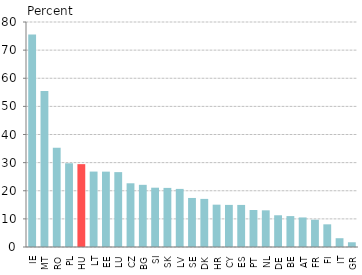
| Category | 2013-2019 |
|---|---|
| IE | 75.526 |
| MT | 55.45 |
| RO | 35.309 |
| PL | 29.769 |
| HU | 29.458 |
| LT | 26.818 |
| EE | 26.793 |
| LU | 26.624 |
| CZ | 22.655 |
| BG | 22.105 |
| SI | 21.085 |
| SK | 21.013 |
| LV | 20.655 |
| SE | 17.436 |
| DK | 17.105 |
| HR | 15.051 |
| CY | 14.967 |
| ES | 14.96 |
| PT | 13.147 |
| NL | 13.041 |
| DE | 11.284 |
| BE | 10.987 |
| AT | 10.507 |
| FR | 9.705 |
| FI | 8.063 |
| IT | 3.124 |
| GR | 1.685 |